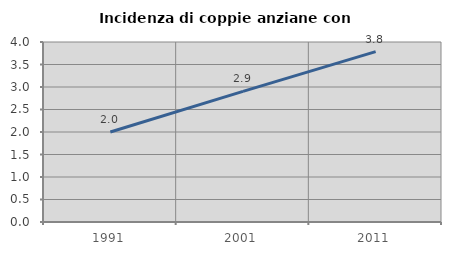
| Category | Incidenza di coppie anziane con figli |
|---|---|
| 1991.0 | 2 |
| 2001.0 | 2.903 |
| 2011.0 | 3.785 |